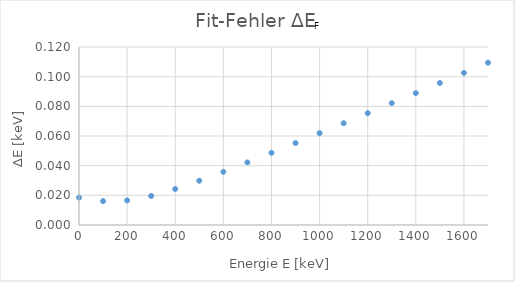
| Category | Series 0 |
|---|---|
| 0.0 | 0.018 |
| 100.0 | 0.016 |
| 200.0 | 0.017 |
| 300.0 | 0.02 |
| 400.0 | 0.024 |
| 500.0 | 0.03 |
| 600.0 | 0.036 |
| 700.0 | 0.042 |
| 800.0 | 0.049 |
| 900.0 | 0.055 |
| 1000.0 | 0.062 |
| 1100.0 | 0.069 |
| 1200.0 | 0.075 |
| 1300.0 | 0.082 |
| 1400.0 | 0.089 |
| 1500.0 | 0.096 |
| 1600.0 | 0.103 |
| 1700.0 | 0.109 |
| 1800.0 | 0.116 |
| 1900.0 | 0.123 |
| 2000.0 | 0.13 |